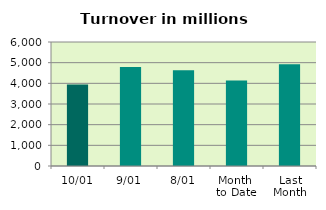
| Category | Series 0 |
|---|---|
| 10/01 | 3937.85 |
| 9/01 | 4787.657 |
| 8/01 | 4629.314 |
| Month 
to Date | 4134.588 |
| Last
Month | 4921.323 |